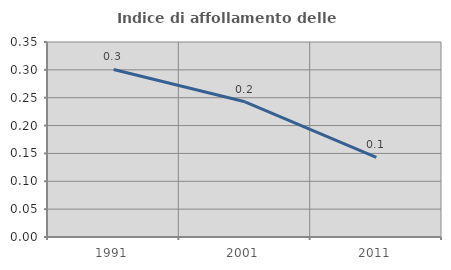
| Category | Indice di affollamento delle abitazioni  |
|---|---|
| 1991.0 | 0.301 |
| 2001.0 | 0.243 |
| 2011.0 | 0.143 |